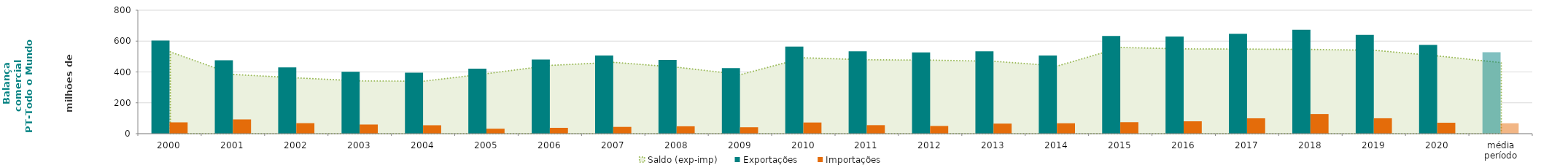
| Category | Exportações  | Importações  |
|---|---|---|
| 2000 | 603.257 | 73.37 |
| 2001 | 476.1 | 92.402 |
| 2002 | 429.586 | 68.07 |
| 2003 | 401.119 | 59.288 |
| 2004 | 394.748 | 54.527 |
| 2005 | 421.259 | 32.137 |
| 2006 | 480.684 | 37.951 |
| 2007 | 506.189 | 43.993 |
| 2008 | 478.345 | 47.836 |
| 2009 | 424.817 | 41.644 |
| 2010 | 564.035 | 72.422 |
| 2011 | 534.142 | 55.21 |
| 2012 | 526.514 | 49.867 |
| 2013 | 534.274 | 65.216 |
| 2014 | 506.348 | 67.339 |
| 2015 | 633.121 | 74.48 |
| 2016 | 629.75 | 80.191 |
| 2017 | 647.86 | 99.579 |
| 2018 | 673.268 | 127.266 |
| 2019 | 640.054 | 99.789 |
| 2020 | 574.61 | 70.842 |
| média período | 527.623 | 67.306 |